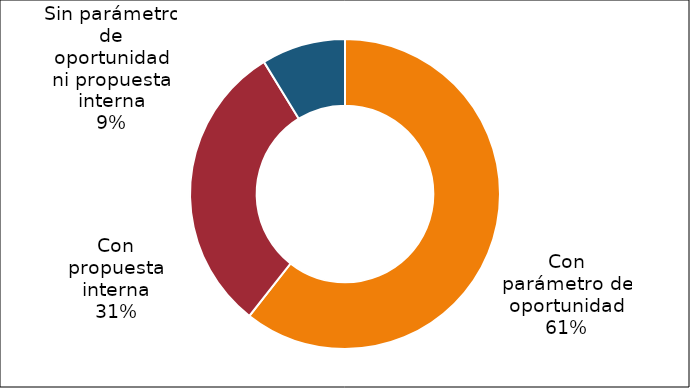
| Category | Series 0 |
|---|---|
| Con parámetro de oportunidad | 83 |
| Con propuesta interna | 42 |
| Sin parámetro de oportunidad ni propuesta interna | 12 |